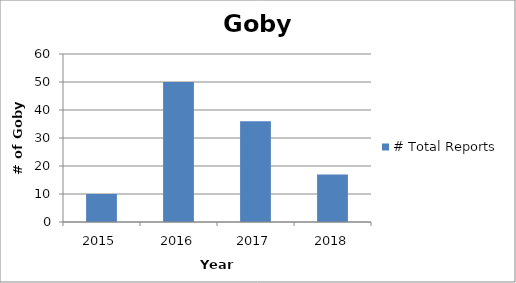
| Category | # Total Reports |
|---|---|
| 2015.0 | 10 |
| 2016.0 | 50 |
| 2017.0 | 36 |
| 2018.0 | 17 |